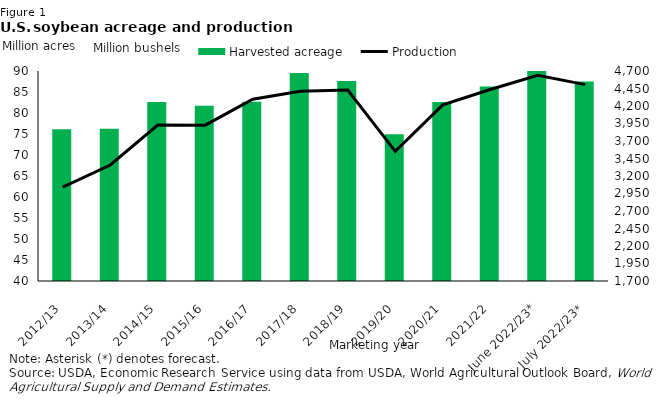
| Category | Harvested acreage |
|---|---|
| 2012/13 | 76.144 |
| 2013/14 | 76.233 |
| 2014/15 | 82.611 |
| 2015/16 | 81.742 |
| 2016/17 | 82.706 |
| 2017/18 | 89.542 |
| 2018/19 | 87.594 |
| 2019/20 | 74.939 |
| 2020/21 | 82.603 |
| 2021/22 | 86.332 |
| June 2022/23* | 90.1 |
| July 2022/23* | 87.511 |